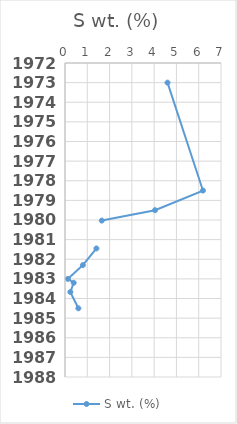
| Category | S wt. (%) |
|---|---|
| 4.6 | 1973 |
| 6.19 | 1978.5 |
| 4.04 | 1979.5 |
| 1.65 | 1980.03 |
| nan | 1980.95 |
| 1.41 | 1981.45 |
| 0.8 | 1982.3 |
| 0.13 | 1983 |
| 0.39 | 1983.2 |
| 0.24 | 1983.67 |
| 0.6 | 1984.5 |